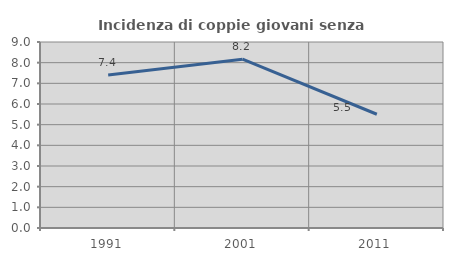
| Category | Incidenza di coppie giovani senza figli |
|---|---|
| 1991.0 | 7.404 |
| 2001.0 | 8.17 |
| 2011.0 | 5.504 |